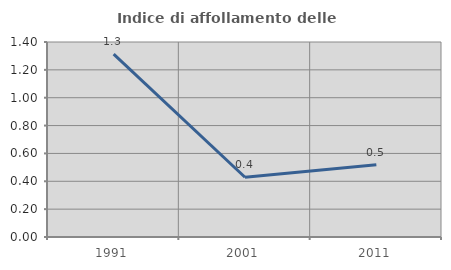
| Category | Indice di affollamento delle abitazioni  |
|---|---|
| 1991.0 | 1.313 |
| 2001.0 | 0.429 |
| 2011.0 | 0.518 |